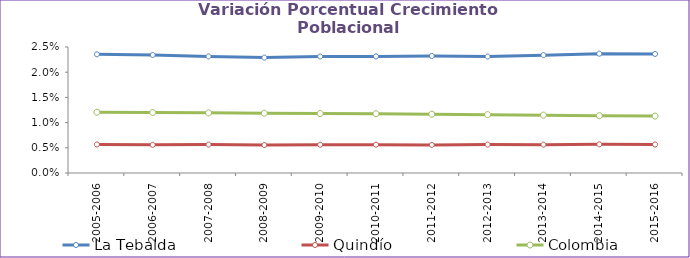
| Category | La Tebaida | Quindío | Colombia |
|---|---|---|---|
| 2005-2006 | 0.024 | 0.006 | 0.012 |
| 2006-2007 | 0.023 | 0.006 | 0.012 |
| 2007-2008 | 0.023 | 0.006 | 0.012 |
| 2008-2009 | 0.023 | 0.006 | 0.012 |
| 2009-2010 | 0.023 | 0.006 | 0.012 |
| 2010-2011 | 0.023 | 0.006 | 0.012 |
| 2011-2012 | 0.023 | 0.006 | 0.012 |
| 2012-2013 | 0.023 | 0.006 | 0.012 |
| 2013-2014 | 0.023 | 0.006 | 0.011 |
| 2014-2015 | 0.024 | 0.006 | 0.011 |
| 2015-2016 | 0.024 | 0.006 | 0.011 |